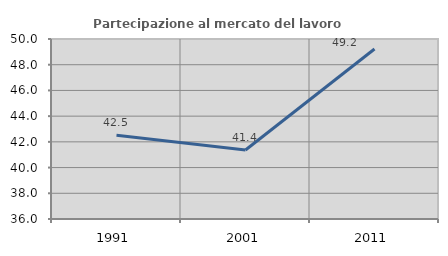
| Category | Partecipazione al mercato del lavoro  femminile |
|---|---|
| 1991.0 | 42.513 |
| 2001.0 | 41.364 |
| 2011.0 | 49.221 |